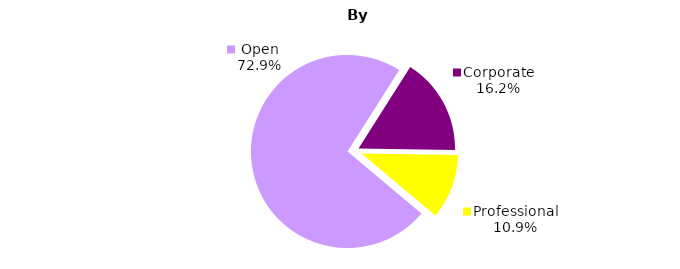
| Category | Series 0 |
|---|---|
| Open | 750149376.736 |
| Corporate | 167086482.227 |
| Professional | 111873914.731 |